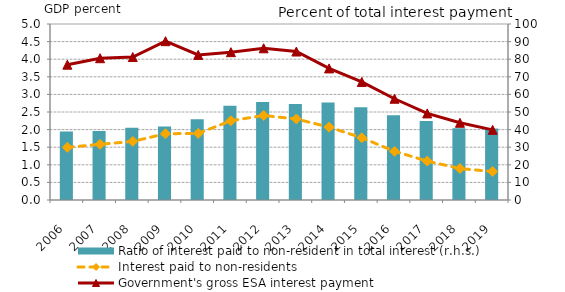
| Category | Ratio of interest paid to non-resident in total interest (r.h.s.) |
|---|---|
| 2006.0 | 38.911 |
| 2007.0 | 39.263 |
| 2008.0 | 40.993 |
| 2009.0 | 41.71 |
| 2010.0 | 45.894 |
| 2011.0 | 53.614 |
| 2012.0 | 55.728 |
| 2013.0 | 54.565 |
| 2014.0 | 55.363 |
| 2015.0 | 52.727 |
| 2016.0 | 48.085 |
| 2017.0 | 44.945 |
| 2018.0 | 40.731 |
| 2019.0 | 40.568 |